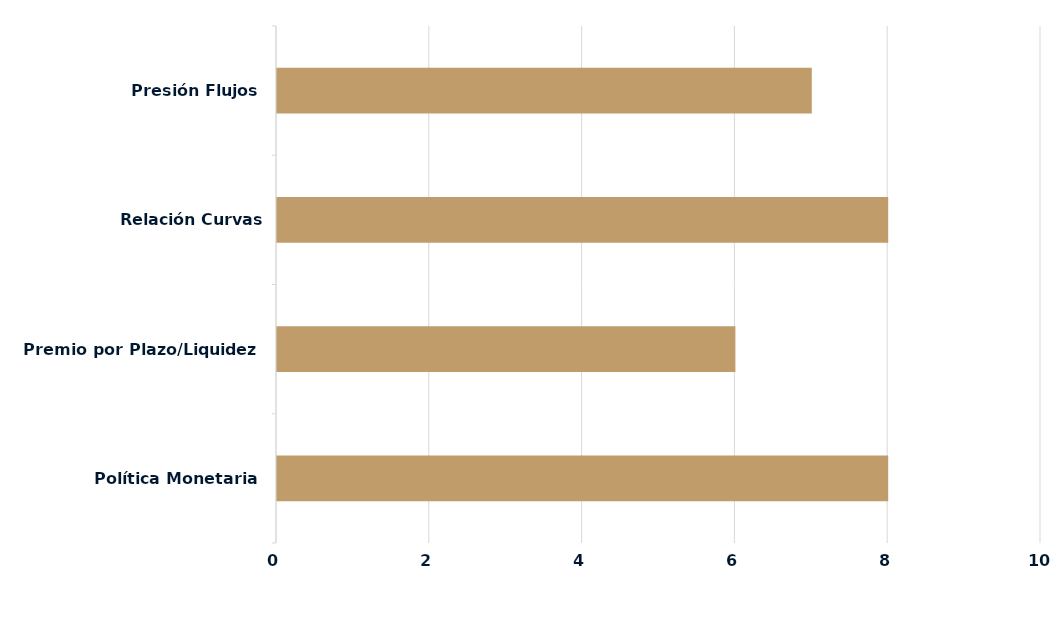
| Category | Series 0 |
|---|---|
| Política Monetaria | 8 |
| Premio por Plazo/Liquidez | 6 |
| Relación Curvas Internacionales | 8 |
| Presión Flujos | 7 |